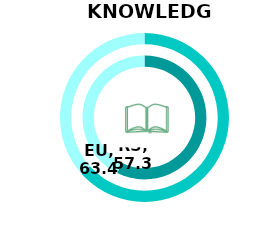
| Category | RS | Series 1 | EU |
|---|---|---|---|
| Index | 57.3 |  | 63.4 |
| Rest | 42.7 |  | 36.6 |